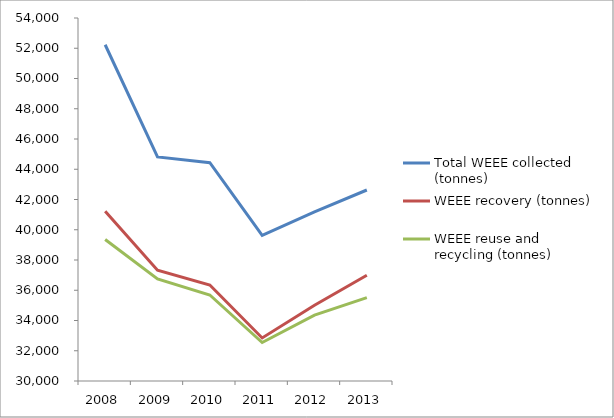
| Category | Total WEEE collected (tonnes) | WEEE recovery (tonnes) | WEEE reuse and recycling (tonnes) |
|---|---|---|---|
| 2008.0 | 52231 | 41217 | 39353 |
| 2009.0 | 44812 | 37323 | 36745 |
| 2010.0 | 44431 | 36343 | 35688 |
| 2011.0 | 39629 | 32846 | 32546 |
| 2012.0 | 41177 | 35012 | 34360 |
| 2013.0 | 42628 | 36994 | 35509 |